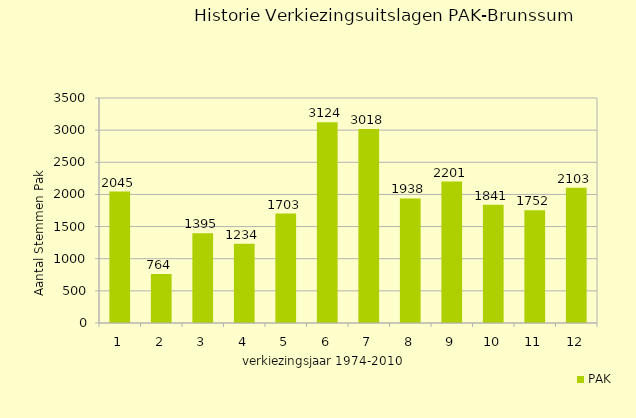
| Category | PAK |
|---|---|
| 0 | 2045 |
| 1 | 764 |
| 2 | 1395 |
| 3 | 1234 |
| 4 | 1703 |
| 5 | 3124 |
| 6 | 3018 |
| 7 | 1938 |
| 8 | 2201 |
| 9 | 1841 |
| 10 | 1752 |
| 11 | 2103 |